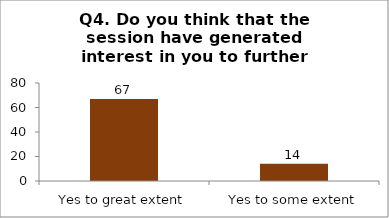
| Category | Q4. Do you think that the session have generated interest in you to further explore the topics? |
|---|---|
| Yes to great extent | 67 |
| Yes to some extent | 14 |